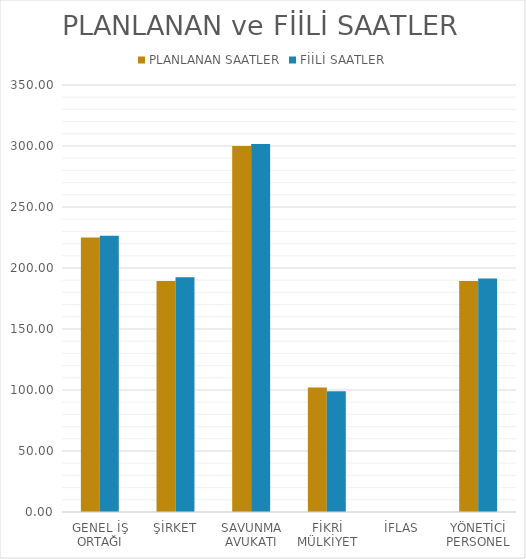
| Category | PLANLANAN SAATLER | FİİLİ SAATLER |
|---|---|---|
| GENEL İŞ ORTAĞI | 225 | 226.5 |
| ŞİRKET | 189.286 | 192.5 |
| SAVUNMA AVUKATI | 300 | 301.714 |
| FİKRİ MÜLKİYET | 102.143 | 99 |
| İFLAS | 0 | 0 |
| YÖNETİCİ PERSONEL | 189.286 | 191.429 |